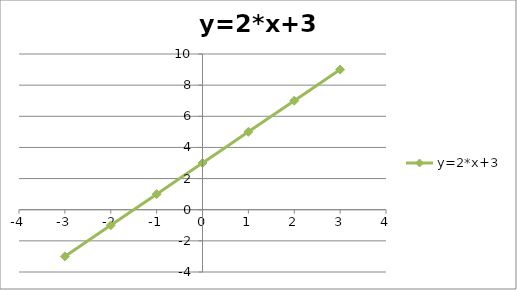
| Category | y=2*x+3 |
|---|---|
| -3.0 | -3 |
| -2.0 | -1 |
| -1.0 | 1 |
| 0.0 | 3 |
| 1.0 | 5 |
| 2.0 | 7 |
| 3.0 | 9 |